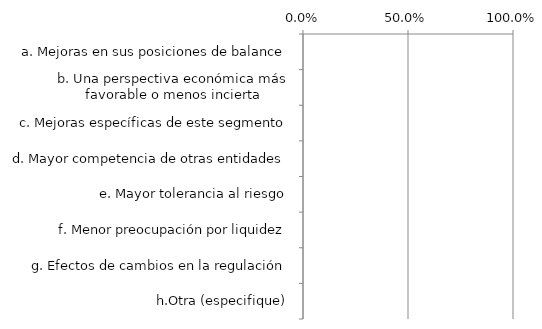
| Category | Series 0 |
|---|---|
| a. Mejoras en sus posiciones de balance | 0 |
| b. Una perspectiva económica más favorable o menos incierta | 0 |
| c. Mejoras específicas de este segmento | 0 |
| d. Mayor competencia de otras entidades | 0 |
| e. Mayor tolerancia al riesgo | 0 |
| f. Menor preocupación por liquidez | 0 |
| g. Efectos de cambios en la regulación | 0 |
| h.Otra (especifique) | 0 |